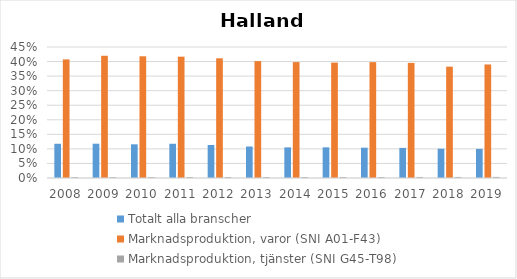
| Category | Totalt alla branscher | Marknadsproduktion, varor (SNI A01-F43) | Marknadsproduktion, tjänster (SNI G45-T98) |
|---|---|---|---|
| 2008.0 | 0.118 | 0.407 | 0.003 |
| 2009.0 | 0.118 | 0.42 | 0.003 |
| 2010.0 | 0.116 | 0.418 | 0.003 |
| 2011.0 | 0.118 | 0.417 | 0.003 |
| 2012.0 | 0.113 | 0.411 | 0.003 |
| 2013.0 | 0.108 | 0.402 | 0.003 |
| 2014.0 | 0.105 | 0.398 | 0.003 |
| 2015.0 | 0.105 | 0.396 | 0.003 |
| 2016.0 | 0.104 | 0.398 | 0.003 |
| 2017.0 | 0.103 | 0.395 | 0.004 |
| 2018.0 | 0.1 | 0.383 | 0.004 |
| 2019.0 | 0.1 | 0.39 | 0.004 |